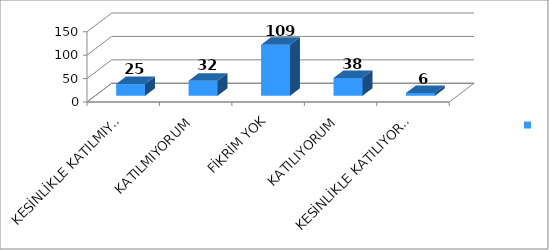
| Category | Series 0 |
|---|---|
| KESİNLİKLE KATILMIYORUM | 25 |
| KATILMIYORUM | 32 |
| FİKRİM YOK | 109 |
| KATILIYORUM | 38 |
| KESİNLİKLE KATILIYORUM | 6 |